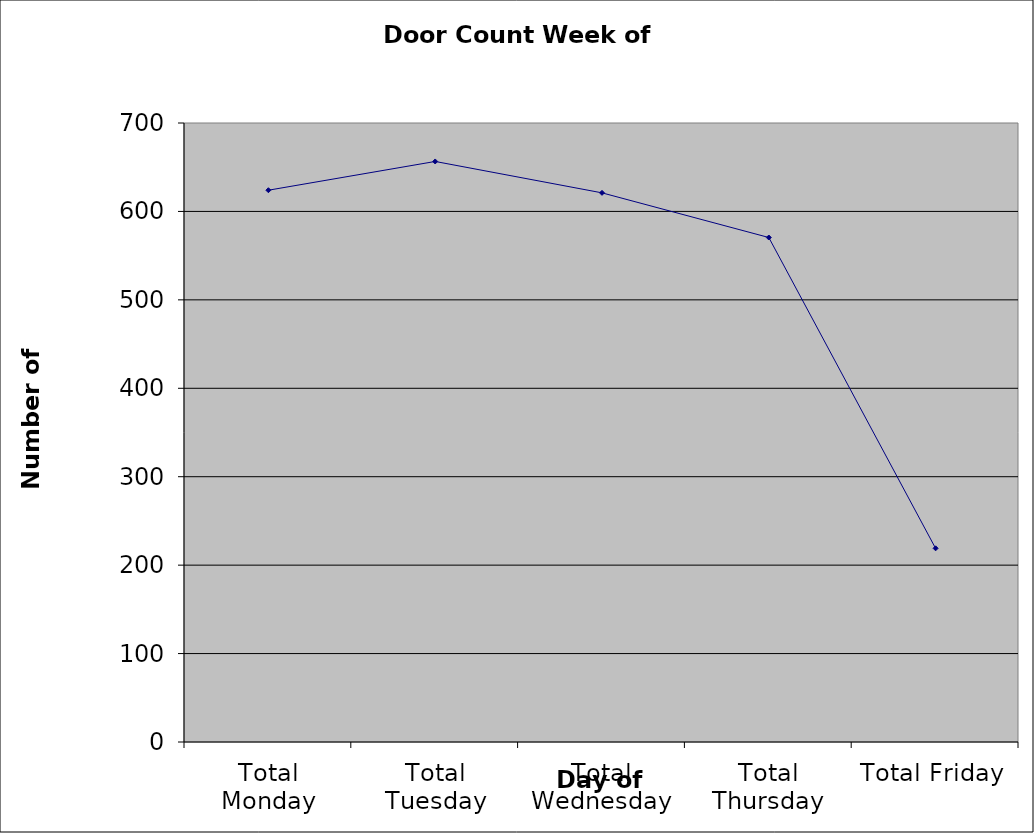
| Category | Series 0 |
|---|---|
| Total Monday | 624 |
| Total Tuesday | 656.5 |
| Total Wednesday | 621 |
| Total Thursday | 570.5 |
| Total Friday | 219 |